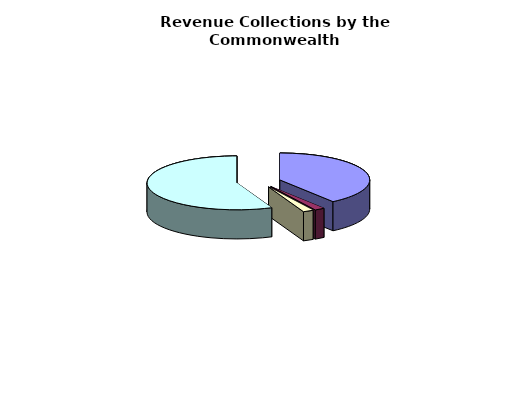
| Category | Series 0 |
|---|---|
| General Fund | 17348564000 |
| Non-General Fund | 792553000 |
| General Fund | 821896000 |
| Non-General Fund | 24487273000 |